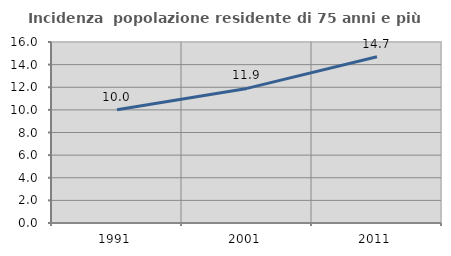
| Category | Incidenza  popolazione residente di 75 anni e più |
|---|---|
| 1991.0 | 10.002 |
| 2001.0 | 11.898 |
| 2011.0 | 14.69 |